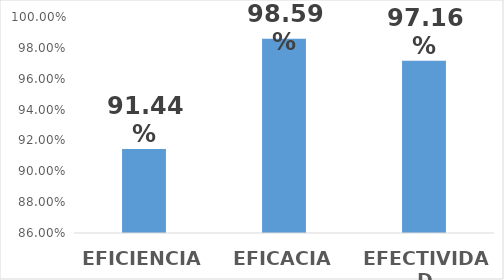
| Category | Series 0 |
|---|---|
| EFICIENCIA | 0.914 |
| EFICACIA | 0.986 |
| EFECTIVIDAD | 0.972 |